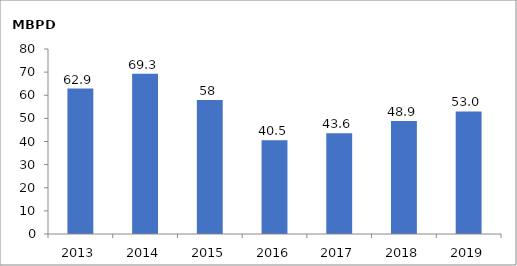
| Category | Series 0 |
|---|---|
| 2013.0 | 62.9 |
| 2014.0 | 69.3 |
| 2015.0 | 58 |
| 2016.0 | 40.5 |
| 2017.0 | 43.6 |
| 2018.0 | 48.9 |
| 2019.0 | 52.984 |